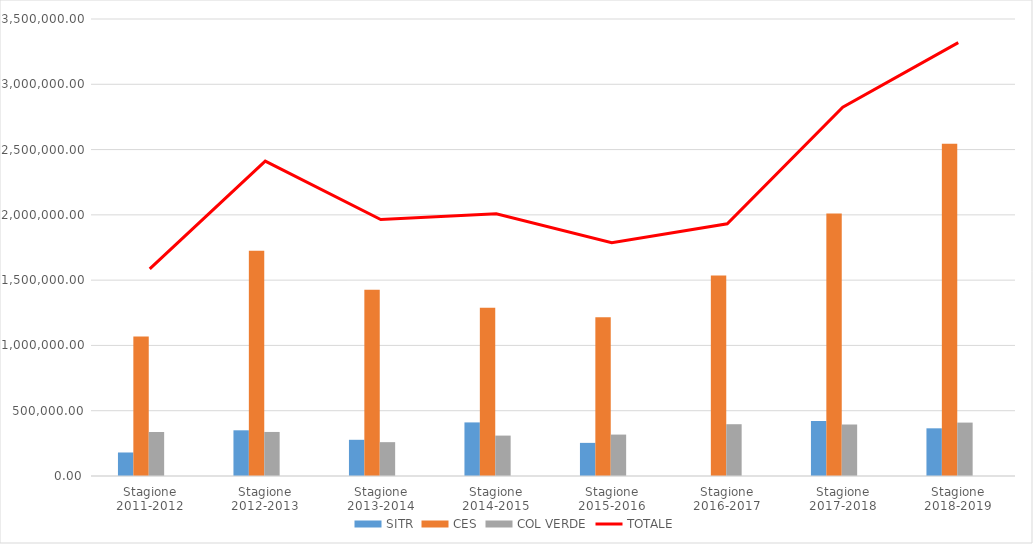
| Category | Series 5 | SITR | CES | COL VERDE | Series 3 | Series 6 |
|---|---|---|---|---|---|---|
| Stagione 2011-2012 |  | 180093 | 1069164.08 | 337080.71 |  |  |
| Stagione 2012-2013 |  | 349972.377 | 1724665.1 | 337317.141 |  |  |
| Stagione 2013-2014 |  | 277271.677 | 1427331.757 | 259224.704 |  |  |
| Stagione 2014-2015 |  | 410393.717 | 1289101.807 | 309510.381 |  |  |
| Stagione 2015-2016 |  | 253687.911 | 1215841.051 | 317189.568 |  |  |
| Stagione 2016-2017 |  | 0 | 1534749.094 | 396600.995 |  |  |
| Stagione 2017-2018 |  | 420617.82 | 2011104.686 | 393537.371 |  |  |
| Stagione 2018-2019 |  | 365211.018 | 2545213.228 | 409072.603 |  |  |